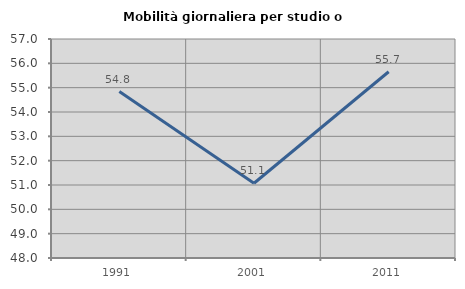
| Category | Mobilità giornaliera per studio o lavoro |
|---|---|
| 1991.0 | 54.839 |
| 2001.0 | 51.071 |
| 2011.0 | 55.654 |